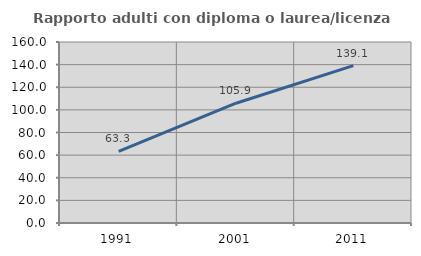
| Category | Rapporto adulti con diploma o laurea/licenza media  |
|---|---|
| 1991.0 | 63.27 |
| 2001.0 | 105.872 |
| 2011.0 | 139.123 |